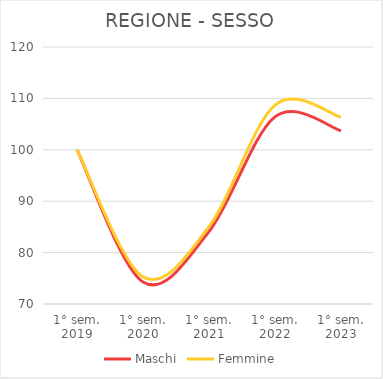
| Category | Maschi | Femmine |
|---|---|---|
| 1° sem.
2019 | 100 | 100 |
| 1° sem.
2020 | 74.275 | 75.28 |
| 1° sem.
2021 | 84.104 | 85.03 |
| 1° sem.
2022 | 106.408 | 108.701 |
| 1° sem.
2023 | 103.705 | 106.36 |